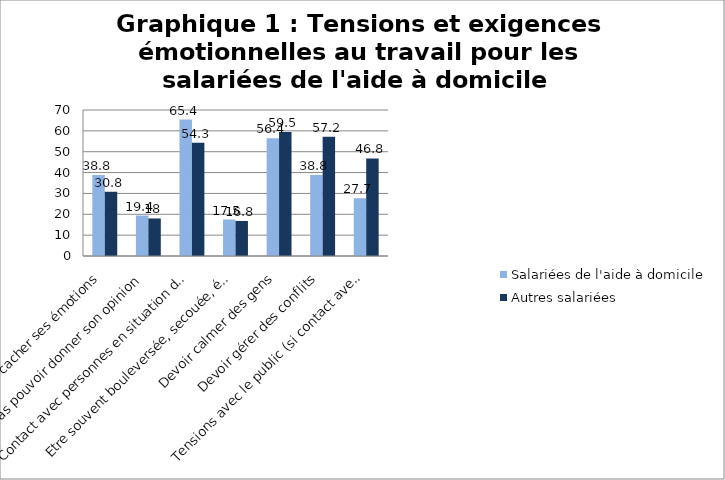
| Category | Salariées de l'aide à domicile | Autres salariées |
|---|---|---|
| Devoir cacher ses émotions | 38.8 | 30.8 |
| Ne pas pouvoir donner son opinion | 19.4 | 18 |
| Contact avec personnes en situation de détresse | 65.4 | 54.3 |
| Etre souvent bouleversée, secouée, émue | 17.5 | 16.8 |
| Devoir calmer des gens | 56.4 | 59.5 |
| Devoir gérer des conflits | 38.8 | 57.2 |
| Tensions avec le public (si contact avec public) | 27.7 | 46.8 |